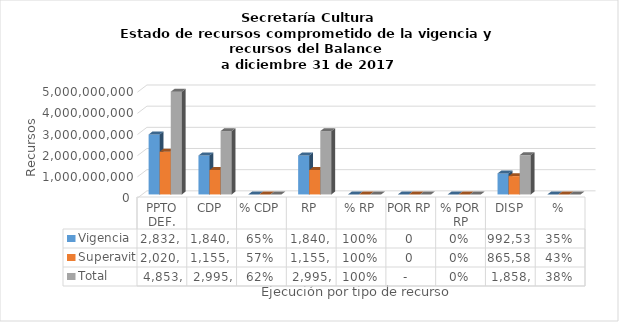
| Category | Vigencia | Superavit | Total |
|---|---|---|---|
| PPTO DEF. | 2832731598.26 | 2020751994 | 4853483592.26 |
| CDP | 1840193170.8 | 1155162249 | 2995355419.8 |
| % CDP | 0.65 | 0.572 | 0.617 |
| RP | 1840193170.8 | 1155162249 | 2995355419.8 |
| % RP | 1 | 1 | 1 |
| POR RP | 0 | 0 | 0 |
| % POR RP | 0 | 0 | 0 |
| DISP | 992538427.46 | 865589745 | 1858128172.46 |
| % | 0.35 | 0.428 | 0.383 |